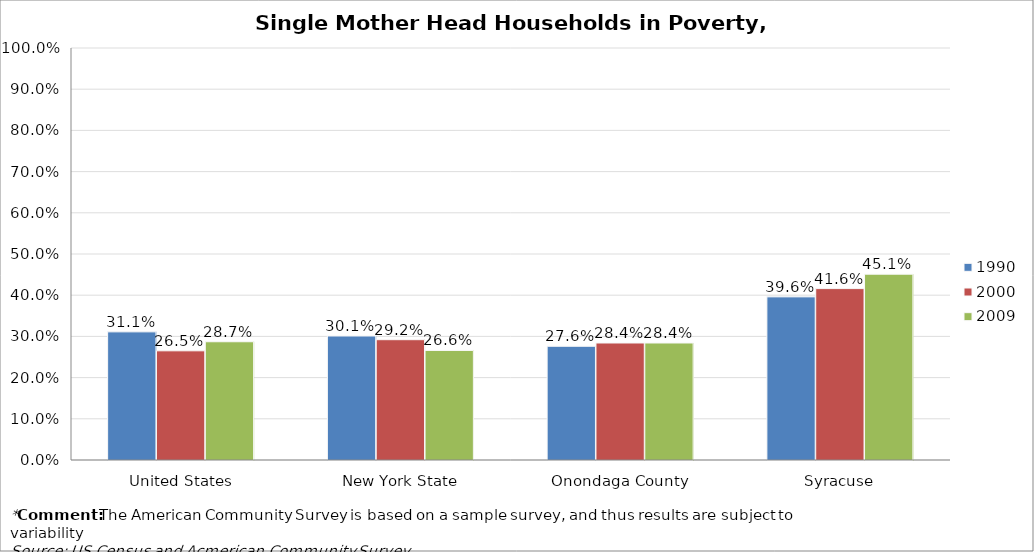
| Category | 1990 | 2000 | 2009 |
|---|---|---|---|
| United States | 0.311 | 0.265 | 0.287 |
| New York State | 0.301 | 0.292 | 0.266 |
| Onondaga County | 0.276 | 0.284 | 0.284 |
| Syracuse | 0.396 | 0.416 | 0.451 |